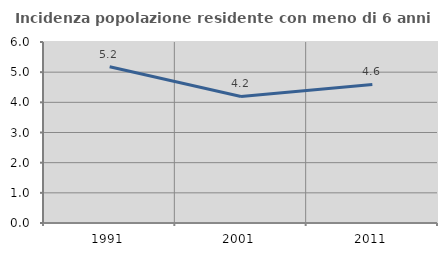
| Category | Incidenza popolazione residente con meno di 6 anni |
|---|---|
| 1991.0 | 5.178 |
| 2001.0 | 4.194 |
| 2011.0 | 4.592 |